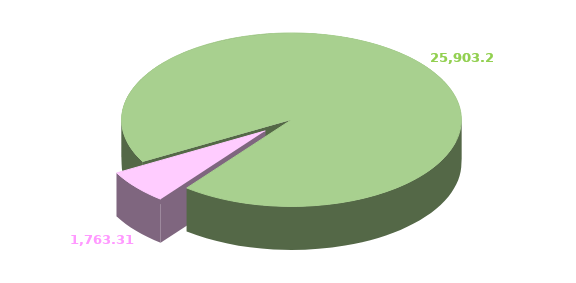
| Category | Series 0 |
|---|---|
| 0 | 25903.289 |
| 1 | 1763.309 |